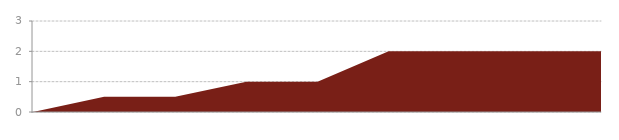
| Category | Series 0 |
|---|---|
| 0 | 0 |
| 1 | 0.5 |
| 2 | 0.5 |
| 3 | 1 |
| 4 | 1 |
| 5 | 2 |
| 6 | 2 |
| 7 | 2 |
| 8 | 2 |